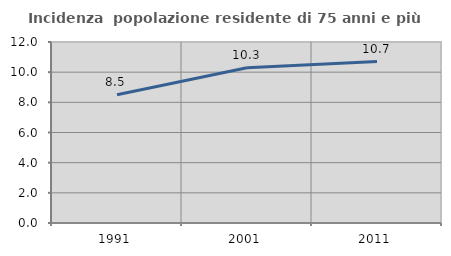
| Category | Incidenza  popolazione residente di 75 anni e più |
|---|---|
| 1991.0 | 8.507 |
| 2001.0 | 10.299 |
| 2011.0 | 10.707 |